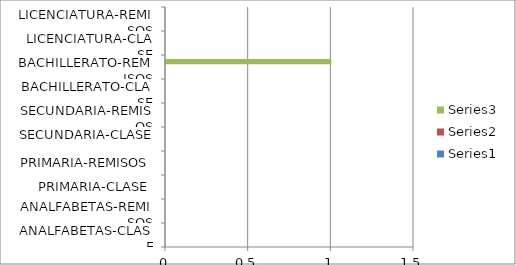
| Category | Series 0 | Series 1 | Series 2 |
|---|---|---|---|
| ANALFABETAS-CLASE |  |  | 0 |
| ANALFABETAS-REMISOS |  |  | 0 |
| PRIMARIA-CLASE |  |  | 0 |
| PRIMARIA-REMISOS |  |  | 0 |
| SECUNDARIA-CLASE |  |  | 0 |
| SECUNDARIA-REMISOS |  |  | 0 |
| BACHILLERATO-CLASE |  |  | 0 |
| BACHILLERATO-REMISOS |  |  | 1 |
| LICENCIATURA-CLASE |  |  | 0 |
| LICENCIATURA-REMISOS |  |  | 0 |